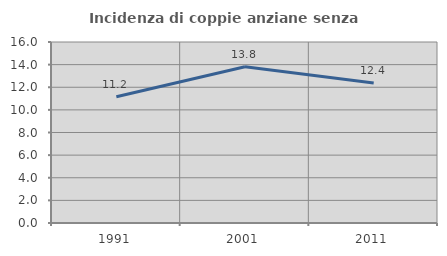
| Category | Incidenza di coppie anziane senza figli  |
|---|---|
| 1991.0 | 11.155 |
| 2001.0 | 13.805 |
| 2011.0 | 12.374 |